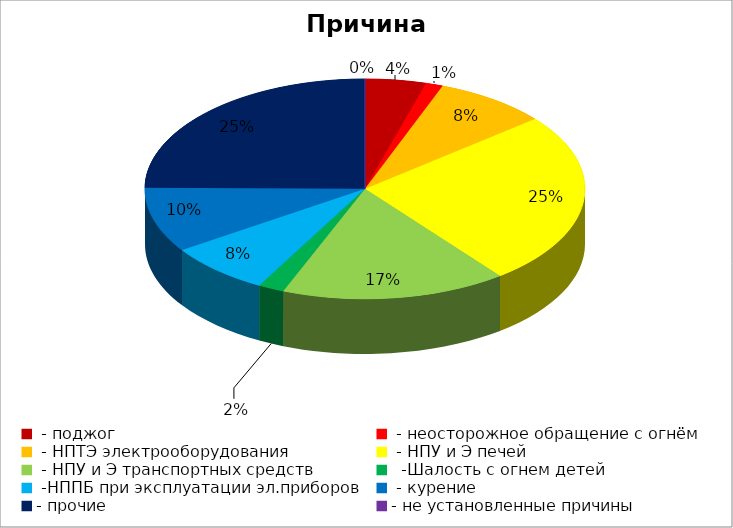
| Category | Причина пожара |
|---|---|
|  - поджог | 7 |
|  - неосторожное обращение с огнём | 2 |
|  - НПТЭ электрооборудования | 13 |
|  - НПУ и Э печей | 40 |
|  - НПУ и Э транспортных средств | 26 |
|   -Шалость с огнем детей | 3 |
|  -НППБ при эксплуатации эл.приборов | 12 |
|  - курение | 15 |
| - прочие | 39 |
| - не установленные причины | 0 |